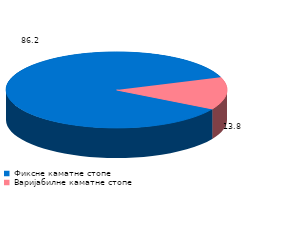
| Category | Series 0 |
|---|---|
| Фиксне каматне стопе | 86.2 |
| Варијабилне каматне стопе | 13.8 |